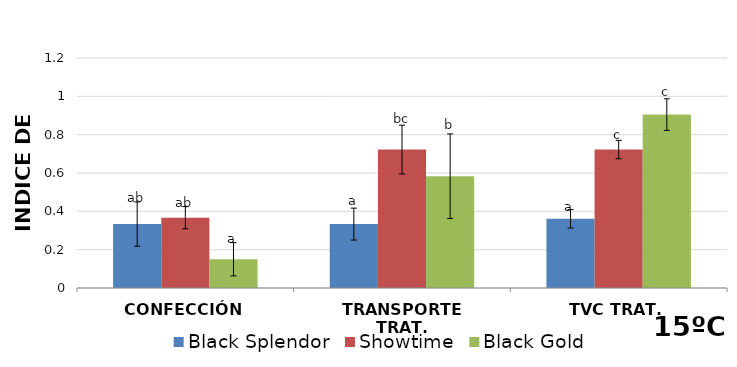
| Category | Black Splendor | Showtime | Black Gold |
|---|---|---|---|
| CONFECCIÓN | 0.333 | 0.367 | 0.15 |
| TRANSPORTE TRAT. | 0.333 | 0.722 | 0.583 |
| TVC TRAT. | 0.361 | 0.722 | 0.905 |